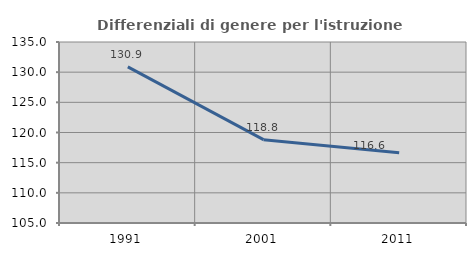
| Category | Differenziali di genere per l'istruzione superiore |
|---|---|
| 1991.0 | 130.882 |
| 2001.0 | 118.81 |
| 2011.0 | 116.644 |